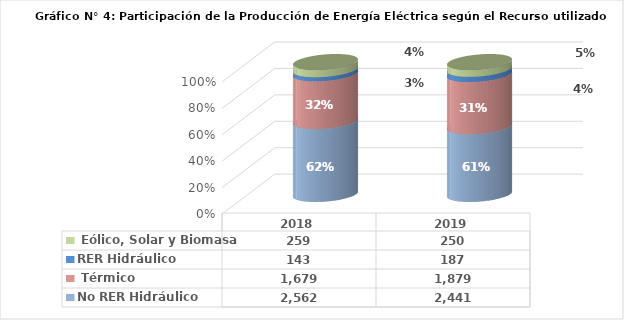
| Category | No RER | RER |
|---|---|---|
| 2018.0 | 1678.787 | 258.638 |
| 2019.0 | 1879.379 | 250.166 |